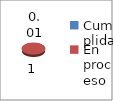
| Category | Series 0 |
|---|---|
| Cumplida | 0.01 |
| En proceso | 1 |